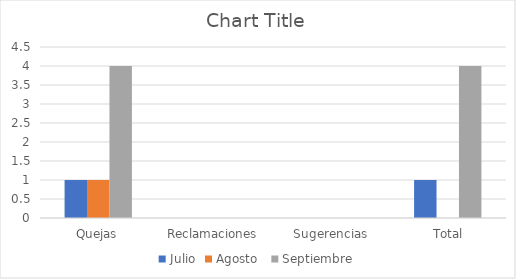
| Category | Julio | Agosto  | Septiembre |
|---|---|---|---|
| Quejas | 1 | 1 | 4 |
| Reclamaciones | 0 | 0 | 0 |
| Sugerencias | 0 | 0 | 0 |
|  Total | 1 | 0 | 4 |